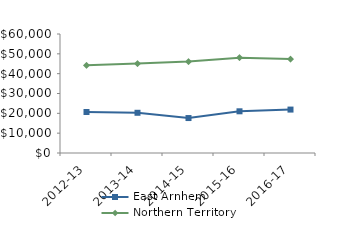
| Category | East Arnhem | Northern Territory |
|---|---|---|
| 2012-13 | 20660.1 | 44232.02 |
| 2013-14 | 20277.78 | 45075.51 |
| 2014-15 | 17621.39 | 46083.65 |
| 2015-16 | 21025.94 | 48046.27 |
| 2016-17 | 21893.92 | 47367.05 |